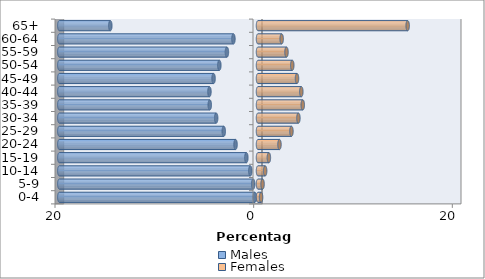
| Category | Males | Females |
|---|---|---|
| 0-4 | -0.32 | 0.31 |
| 5-9 | -0.485 | 0.46 |
| 10-14 | -0.775 | 0.72 |
| 15-19 | -1.173 | 1.094 |
| 20-24 | -2.26 | 2.163 |
| 25-29 | -3.447 | 3.367 |
| 30-34 | -4.212 | 4.068 |
| 35-39 | -4.856 | 4.507 |
| 40-44 | -4.888 | 4.361 |
| 45-49 | -4.474 | 3.927 |
| 50-54 | -3.892 | 3.451 |
| 55-59 | -3.13 | 2.868 |
| 60-64 | -2.474 | 2.382 |
| 65+ | -14.869 | 15.068 |